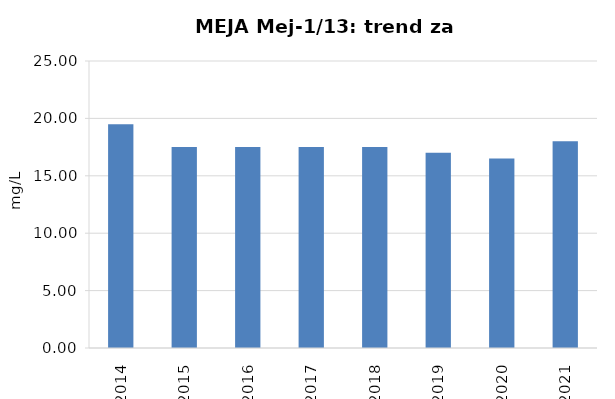
| Category | Vsota |
|---|---|
| 2014 | 19.5 |
| 2015 | 17.5 |
| 2016 | 17.5 |
| 2017 | 17.5 |
| 2018 | 17.5 |
| 2019 | 17 |
| 2020 | 16.5 |
| 2021 | 18 |